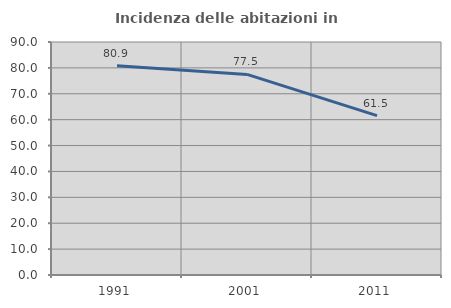
| Category | Incidenza delle abitazioni in proprietà  |
|---|---|
| 1991.0 | 80.851 |
| 2001.0 | 77.47 |
| 2011.0 | 61.538 |